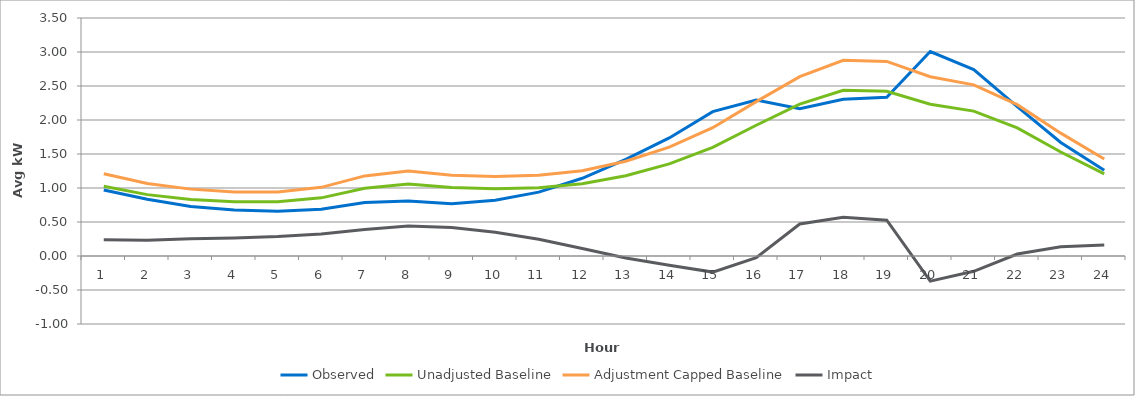
| Category | Observed | Unadjusted Baseline | Adjustment Capped Baseline | Impact |
|---|---|---|---|---|
| 0 | 0.971 | 1.025 | 1.211 | 0.239 |
| 1 | 0.833 | 0.903 | 1.066 | 0.233 |
| 2 | 0.73 | 0.833 | 0.983 | 0.254 |
| 3 | 0.678 | 0.797 | 0.941 | 0.263 |
| 4 | 0.657 | 0.798 | 0.942 | 0.286 |
| 5 | 0.686 | 0.855 | 1.01 | 0.324 |
| 6 | 0.788 | 0.997 | 1.178 | 0.39 |
| 7 | 0.811 | 1.059 | 1.251 | 0.44 |
| 8 | 0.77 | 1.007 | 1.189 | 0.419 |
| 9 | 0.82 | 0.99 | 1.169 | 0.35 |
| 10 | 0.939 | 1.005 | 1.187 | 0.247 |
| 11 | 1.143 | 1.062 | 1.254 | 0.111 |
| 12 | 1.422 | 1.18 | 1.393 | -0.029 |
| 13 | 1.736 | 1.355 | 1.601 | -0.136 |
| 14 | 2.124 | 1.597 | 1.887 | -0.237 |
| 15 | 2.294 | 1.922 | 2.271 | -0.024 |
| 16 | 2.166 | 2.233 | 2.638 | 0.471 |
| 17 | 2.306 | 2.436 | 2.877 | 0.571 |
| 18 | 2.334 | 2.423 | 2.862 | 0.527 |
| 19 | 3.006 | 2.232 | 2.637 | -0.369 |
| 20 | 2.742 | 2.13 | 2.516 | -0.225 |
| 21 | 2.197 | 1.884 | 2.226 | 0.028 |
| 22 | 1.67 | 1.529 | 1.807 | 0.136 |
| 23 | 1.263 | 1.207 | 1.426 | 0.163 |